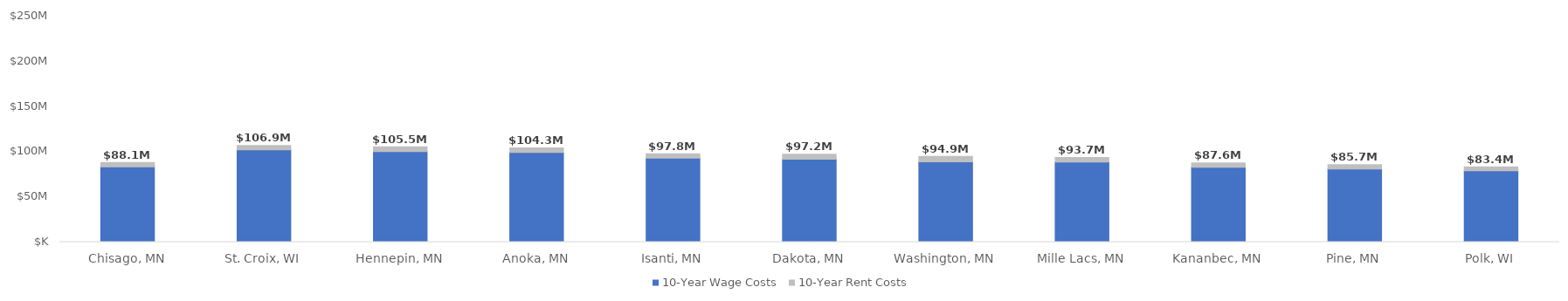
| Category | 10-Year Wage Costs | 10-Year Rent Costs | Total 10 Year Wage + Rent Costs |
|---|---|---|---|
| Chisago, MN | 83251051.583 | 4882500 | 88133551.583 |
| St. Croix, WI | 102033340.077 | 4867500 | 106900840.077 |
| Hennepin, MN | 100032082.458 | 5505000 | 105537082.458 |
| Anoka, MN | 99119822.704 | 5160000 | 104279822.704 |
| Isanti, MN | 92848101.422 | 4942500 | 97790601.422 |
| Dakota, MN | 91641254.481 | 5527500 | 97168754.481 |
| Washington, MN | 88739799.708 | 6195000 | 94934799.708 |
| Mille Lacs, MN | 88671038.495 | 5062500 | 93733538.495 |
| Kananbec, MN | 82699800.227 | 4882500 | 87582300.227 |
| Pine, MN | 80863897.245 | 4882500 | 85746397.245 |
| Polk, WI | 78822634.423 | 4537500 | 83360134.423 |